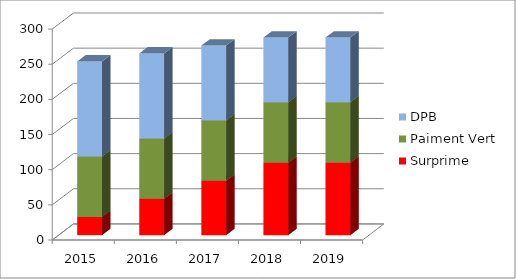
| Category | Surprime | Paiment Vert | DPB |
|---|---|---|---|
| 2015.0 | 26 | 86 | 135 |
| 2016.0 | 51.67 | 86 | 120.67 |
| 2017.0 | 77.34 | 86 | 106.34 |
| 2018.0 | 103 | 86 | 92 |
| 2019.0 | 103 | 86 | 92 |